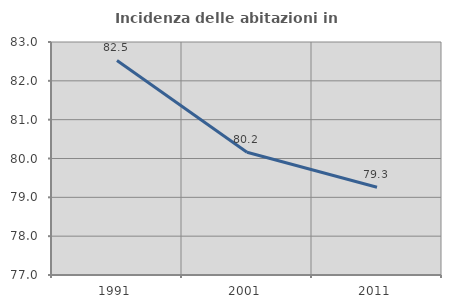
| Category | Incidenza delle abitazioni in proprietà  |
|---|---|
| 1991.0 | 82.526 |
| 2001.0 | 80.161 |
| 2011.0 | 79.259 |